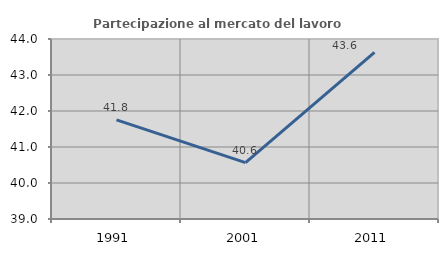
| Category | Partecipazione al mercato del lavoro  femminile |
|---|---|
| 1991.0 | 41.756 |
| 2001.0 | 40.564 |
| 2011.0 | 43.626 |